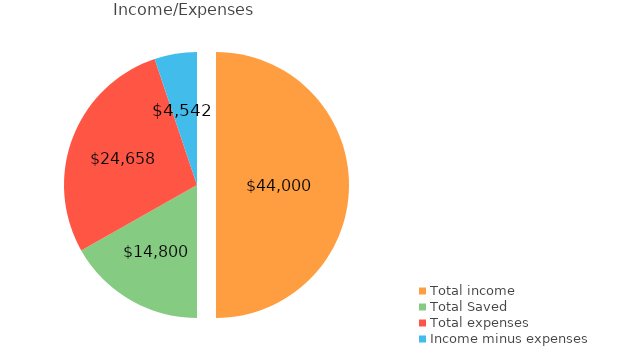
| Category | Series 0 |
|---|---|
| 0 | 44000 |
| 1 | 14800 |
| 2 | 24658 |
| 3 | 4542 |